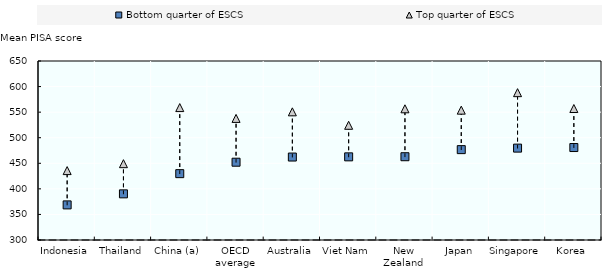
| Category | Bottom quarter of ESCS | Top quarter of ESCS |
|---|---|---|
| Indonesia | 368.62 | 435.681 |
| Thailand | 390.221 | 449.219 |
| China (a) | 429.735 | 558.921 |
| OECD average | 452.094 | 537.727 |
| Australia | 462.224 | 550.587 |
| Viet Nam | 462.58 | 524.303 |
| New Zealand | 462.823 | 556.541 |
| Japan | 476.694 | 553.885 |
| Singapore | 479.659 | 588.087 |
| Korea | 480.786 | 557.073 |